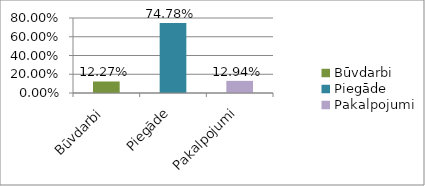
| Category | Series 0 |
|---|---|
| Būvdarbi | 0.123 |
| Piegāde | 0.748 |
| Pakalpojumi | 0.129 |